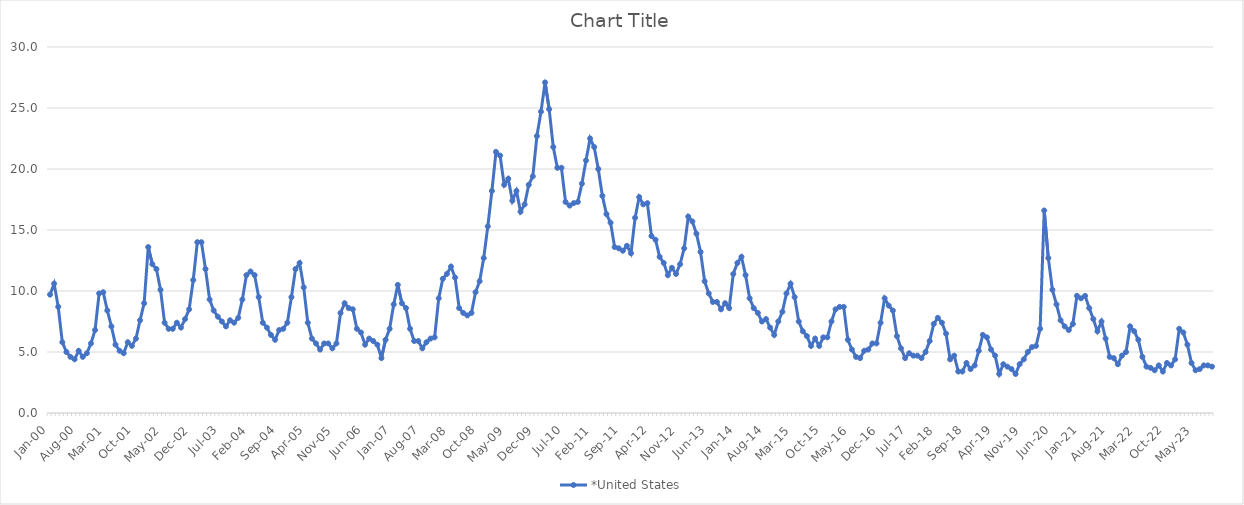
| Category | *United States | Alaska | Alabama | Arkansas | Arizona | California | Colorado | Connecticut | Delaware | Florida | Georgia | Hawaii | Iowa | Idaho | Illinois | Indiana | Kansas | Kentucky | Louisiana | Massachusetts | Maryland | Maine | Michigan | Minnesota | Missouri | Mississippi | Montana | North Carolina | North Dakota | Nebraska | New Hampshire | New Jersey | New Mexico | Nevada | New York | Ohio | Oklahoma | Oregon | Pennsylvania | Rhode Island | South Carolina | South Dakota | Tennessee | Texas | Utah | Virginia | Vermont | Washington | Wisconsin | West Virginia | Wyoming |
|---|---|---|---|---|---|---|---|---|---|---|---|---|---|---|---|---|---|---|---|---|---|---|---|---|---|---|---|---|---|---|---|---|---|---|---|---|---|---|---|---|---|---|---|---|---|---|---|---|---|---|---|
| Jan-00 | 9.7 |  |  |  |  |  |  |  |  |  |  |  |  |  |  |  |  |  |  |  |  |  |  |  |  |  |  |  |  |  |  |  |  |  |  |  |  |  |  |  |  |  |  |  |  |  |  |  |  |  |  |
| Feb-00 | 10.6 |  |  |  |  |  |  |  |  |  |  |  |  |  |  |  |  |  |  |  |  |  |  |  |  |  |  |  |  |  |  |  |  |  |  |  |  |  |  |  |  |  |  |  |  |  |  |  |  |  |  |
| Mar-00 | 8.7 |  |  |  |  |  |  |  |  |  |  |  |  |  |  |  |  |  |  |  |  |  |  |  |  |  |  |  |  |  |  |  |  |  |  |  |  |  |  |  |  |  |  |  |  |  |  |  |  |  |  |
| Apr-00 | 5.8 |  |  |  |  |  |  |  |  |  |  |  |  |  |  |  |  |  |  |  |  |  |  |  |  |  |  |  |  |  |  |  |  |  |  |  |  |  |  |  |  |  |  |  |  |  |  |  |  |  |  |
| May-00 | 5 |  |  |  |  |  |  |  |  |  |  |  |  |  |  |  |  |  |  |  |  |  |  |  |  |  |  |  |  |  |  |  |  |  |  |  |  |  |  |  |  |  |  |  |  |  |  |  |  |  |  |
| Jun-00 | 4.6 |  |  |  |  |  |  |  |  |  |  |  |  |  |  |  |  |  |  |  |  |  |  |  |  |  |  |  |  |  |  |  |  |  |  |  |  |  |  |  |  |  |  |  |  |  |  |  |  |  |  |
| Jul-00 | 4.4 |  |  |  |  |  |  |  |  |  |  |  |  |  |  |  |  |  |  |  |  |  |  |  |  |  |  |  |  |  |  |  |  |  |  |  |  |  |  |  |  |  |  |  |  |  |  |  |  |  |  |
| Aug-00 | 5.1 |  |  |  |  |  |  |  |  |  |  |  |  |  |  |  |  |  |  |  |  |  |  |  |  |  |  |  |  |  |  |  |  |  |  |  |  |  |  |  |  |  |  |  |  |  |  |  |  |  |  |
| Sep-00 | 4.6 |  |  |  |  |  |  |  |  |  |  |  |  |  |  |  |  |  |  |  |  |  |  |  |  |  |  |  |  |  |  |  |  |  |  |  |  |  |  |  |  |  |  |  |  |  |  |  |  |  |  |
| Oct-00 | 4.9 |  |  |  |  |  |  |  |  |  |  |  |  |  |  |  |  |  |  |  |  |  |  |  |  |  |  |  |  |  |  |  |  |  |  |  |  |  |  |  |  |  |  |  |  |  |  |  |  |  |  |
| Nov-00 | 5.7 |  |  |  |  |  |  |  |  |  |  |  |  |  |  |  |  |  |  |  |  |  |  |  |  |  |  |  |  |  |  |  |  |  |  |  |  |  |  |  |  |  |  |  |  |  |  |  |  |  |  |
| Dec-00 | 6.8 |  |  |  |  |  |  |  |  |  |  |  |  |  |  |  |  |  |  |  |  |  |  |  |  |  |  |  |  |  |  |  |  |  |  |  |  |  |  |  |  |  |  |  |  |  |  |  |  |  |  |
| Jan-01 | 9.8 |  |  |  |  |  |  |  |  |  |  |  |  |  |  |  |  |  |  |  |  |  |  |  |  |  |  |  |  |  |  |  |  |  |  |  |  |  |  |  |  |  |  |  |  |  |  |  |  |  |  |
| Feb-01 | 9.9 |  |  |  |  |  |  |  |  |  |  |  |  |  |  |  |  |  |  |  |  |  |  |  |  |  |  |  |  |  |  |  |  |  |  |  |  |  |  |  |  |  |  |  |  |  |  |  |  |  |  |
| Mar-01 | 8.4 |  |  |  |  |  |  |  |  |  |  |  |  |  |  |  |  |  |  |  |  |  |  |  |  |  |  |  |  |  |  |  |  |  |  |  |  |  |  |  |  |  |  |  |  |  |  |  |  |  |  |
| Apr-01 | 7.1 |  |  |  |  |  |  |  |  |  |  |  |  |  |  |  |  |  |  |  |  |  |  |  |  |  |  |  |  |  |  |  |  |  |  |  |  |  |  |  |  |  |  |  |  |  |  |  |  |  |  |
| May-01 | 5.6 |  |  |  |  |  |  |  |  |  |  |  |  |  |  |  |  |  |  |  |  |  |  |  |  |  |  |  |  |  |  |  |  |  |  |  |  |  |  |  |  |  |  |  |  |  |  |  |  |  |  |
| Jun-01 | 5.1 |  |  |  |  |  |  |  |  |  |  |  |  |  |  |  |  |  |  |  |  |  |  |  |  |  |  |  |  |  |  |  |  |  |  |  |  |  |  |  |  |  |  |  |  |  |  |  |  |  |  |
| Jul-01 | 4.9 |  |  |  |  |  |  |  |  |  |  |  |  |  |  |  |  |  |  |  |  |  |  |  |  |  |  |  |  |  |  |  |  |  |  |  |  |  |  |  |  |  |  |  |  |  |  |  |  |  |  |
| Aug-01 | 5.8 |  |  |  |  |  |  |  |  |  |  |  |  |  |  |  |  |  |  |  |  |  |  |  |  |  |  |  |  |  |  |  |  |  |  |  |  |  |  |  |  |  |  |  |  |  |  |  |  |  |  |
| Sep-01 | 5.5 |  |  |  |  |  |  |  |  |  |  |  |  |  |  |  |  |  |  |  |  |  |  |  |  |  |  |  |  |  |  |  |  |  |  |  |  |  |  |  |  |  |  |  |  |  |  |  |  |  |  |
| Oct-01 | 6.1 |  |  |  |  |  |  |  |  |  |  |  |  |  |  |  |  |  |  |  |  |  |  |  |  |  |  |  |  |  |  |  |  |  |  |  |  |  |  |  |  |  |  |  |  |  |  |  |  |  |  |
| Nov-01 | 7.6 |  |  |  |  |  |  |  |  |  |  |  |  |  |  |  |  |  |  |  |  |  |  |  |  |  |  |  |  |  |  |  |  |  |  |  |  |  |  |  |  |  |  |  |  |  |  |  |  |  |  |
| Dec-01 | 9 |  |  |  |  |  |  |  |  |  |  |  |  |  |  |  |  |  |  |  |  |  |  |  |  |  |  |  |  |  |  |  |  |  |  |  |  |  |  |  |  |  |  |  |  |  |  |  |  |  |  |
| Jan-02 | 13.6 |  |  |  |  |  |  |  |  |  |  |  |  |  |  |  |  |  |  |  |  |  |  |  |  |  |  |  |  |  |  |  |  |  |  |  |  |  |  |  |  |  |  |  |  |  |  |  |  |  |  |
| Feb-02 | 12.2 |  |  |  |  |  |  |  |  |  |  |  |  |  |  |  |  |  |  |  |  |  |  |  |  |  |  |  |  |  |  |  |  |  |  |  |  |  |  |  |  |  |  |  |  |  |  |  |  |  |  |
| Mar-02 | 11.8 |  |  |  |  |  |  |  |  |  |  |  |  |  |  |  |  |  |  |  |  |  |  |  |  |  |  |  |  |  |  |  |  |  |  |  |  |  |  |  |  |  |  |  |  |  |  |  |  |  |  |
| Apr-02 | 10.1 |  |  |  |  |  |  |  |  |  |  |  |  |  |  |  |  |  |  |  |  |  |  |  |  |  |  |  |  |  |  |  |  |  |  |  |  |  |  |  |  |  |  |  |  |  |  |  |  |  |  |
| May-02 | 7.4 |  |  |  |  |  |  |  |  |  |  |  |  |  |  |  |  |  |  |  |  |  |  |  |  |  |  |  |  |  |  |  |  |  |  |  |  |  |  |  |  |  |  |  |  |  |  |  |  |  |  |
| Jun-02 | 6.9 |  |  |  |  |  |  |  |  |  |  |  |  |  |  |  |  |  |  |  |  |  |  |  |  |  |  |  |  |  |  |  |  |  |  |  |  |  |  |  |  |  |  |  |  |  |  |  |  |  |  |
| Jul-02 | 6.9 |  |  |  |  |  |  |  |  |  |  |  |  |  |  |  |  |  |  |  |  |  |  |  |  |  |  |  |  |  |  |  |  |  |  |  |  |  |  |  |  |  |  |  |  |  |  |  |  |  |  |
| Aug-02 | 7.4 |  |  |  |  |  |  |  |  |  |  |  |  |  |  |  |  |  |  |  |  |  |  |  |  |  |  |  |  |  |  |  |  |  |  |  |  |  |  |  |  |  |  |  |  |  |  |  |  |  |  |
| Sep-02 | 7 |  |  |  |  |  |  |  |  |  |  |  |  |  |  |  |  |  |  |  |  |  |  |  |  |  |  |  |  |  |  |  |  |  |  |  |  |  |  |  |  |  |  |  |  |  |  |  |  |  |  |
| Oct-02 | 7.7 |  |  |  |  |  |  |  |  |  |  |  |  |  |  |  |  |  |  |  |  |  |  |  |  |  |  |  |  |  |  |  |  |  |  |  |  |  |  |  |  |  |  |  |  |  |  |  |  |  |  |
| Nov-02 | 8.5 |  |  |  |  |  |  |  |  |  |  |  |  |  |  |  |  |  |  |  |  |  |  |  |  |  |  |  |  |  |  |  |  |  |  |  |  |  |  |  |  |  |  |  |  |  |  |  |  |  |  |
| Dec-02 | 10.9 |  |  |  |  |  |  |  |  |  |  |  |  |  |  |  |  |  |  |  |  |  |  |  |  |  |  |  |  |  |  |  |  |  |  |  |  |  |  |  |  |  |  |  |  |  |  |  |  |  |  |
| Jan-03 | 14 |  |  |  |  |  |  |  |  |  |  |  |  |  |  |  |  |  |  |  |  |  |  |  |  |  |  |  |  |  |  |  |  |  |  |  |  |  |  |  |  |  |  |  |  |  |  |  |  |  |  |
| Feb-03 | 14 |  |  |  |  |  |  |  |  |  |  |  |  |  |  |  |  |  |  |  |  |  |  |  |  |  |  |  |  |  |  |  |  |  |  |  |  |  |  |  |  |  |  |  |  |  |  |  |  |  |  |
| Mar-03 | 11.8 |  |  |  |  |  |  |  |  |  |  |  |  |  |  |  |  |  |  |  |  |  |  |  |  |  |  |  |  |  |  |  |  |  |  |  |  |  |  |  |  |  |  |  |  |  |  |  |  |  |  |
| Apr-03 | 9.3 |  |  |  |  |  |  |  |  |  |  |  |  |  |  |  |  |  |  |  |  |  |  |  |  |  |  |  |  |  |  |  |  |  |  |  |  |  |  |  |  |  |  |  |  |  |  |  |  |  |  |
| May-03 | 8.4 |  |  |  |  |  |  |  |  |  |  |  |  |  |  |  |  |  |  |  |  |  |  |  |  |  |  |  |  |  |  |  |  |  |  |  |  |  |  |  |  |  |  |  |  |  |  |  |  |  |  |
| Jun-03 | 7.9 |  |  |  |  |  |  |  |  |  |  |  |  |  |  |  |  |  |  |  |  |  |  |  |  |  |  |  |  |  |  |  |  |  |  |  |  |  |  |  |  |  |  |  |  |  |  |  |  |  |  |
| Jul-03 | 7.5 |  |  |  |  |  |  |  |  |  |  |  |  |  |  |  |  |  |  |  |  |  |  |  |  |  |  |  |  |  |  |  |  |  |  |  |  |  |  |  |  |  |  |  |  |  |  |  |  |  |  |
| Aug-03 | 7.1 |  |  |  |  |  |  |  |  |  |  |  |  |  |  |  |  |  |  |  |  |  |  |  |  |  |  |  |  |  |  |  |  |  |  |  |  |  |  |  |  |  |  |  |  |  |  |  |  |  |  |
| Sep-03 | 7.6 |  |  |  |  |  |  |  |  |  |  |  |  |  |  |  |  |  |  |  |  |  |  |  |  |  |  |  |  |  |  |  |  |  |  |  |  |  |  |  |  |  |  |  |  |  |  |  |  |  |  |
| Oct-03 | 7.4 |  |  |  |  |  |  |  |  |  |  |  |  |  |  |  |  |  |  |  |  |  |  |  |  |  |  |  |  |  |  |  |  |  |  |  |  |  |  |  |  |  |  |  |  |  |  |  |  |  |  |
| Nov-03 | 7.8 |  |  |  |  |  |  |  |  |  |  |  |  |  |  |  |  |  |  |  |  |  |  |  |  |  |  |  |  |  |  |  |  |  |  |  |  |  |  |  |  |  |  |  |  |  |  |  |  |  |  |
| Dec-03 | 9.3 |  |  |  |  |  |  |  |  |  |  |  |  |  |  |  |  |  |  |  |  |  |  |  |  |  |  |  |  |  |  |  |  |  |  |  |  |  |  |  |  |  |  |  |  |  |  |  |  |  |  |
| Jan-04 | 11.3 |  |  |  |  |  |  |  |  |  |  |  |  |  |  |  |  |  |  |  |  |  |  |  |  |  |  |  |  |  |  |  |  |  |  |  |  |  |  |  |  |  |  |  |  |  |  |  |  |  |  |
| Feb-04 | 11.6 |  |  |  |  |  |  |  |  |  |  |  |  |  |  |  |  |  |  |  |  |  |  |  |  |  |  |  |  |  |  |  |  |  |  |  |  |  |  |  |  |  |  |  |  |  |  |  |  |  |  |
| Mar-04 | 11.3 |  |  |  |  |  |  |  |  |  |  |  |  |  |  |  |  |  |  |  |  |  |  |  |  |  |  |  |  |  |  |  |  |  |  |  |  |  |  |  |  |  |  |  |  |  |  |  |  |  |  |
| Apr-04 | 9.5 |  |  |  |  |  |  |  |  |  |  |  |  |  |  |  |  |  |  |  |  |  |  |  |  |  |  |  |  |  |  |  |  |  |  |  |  |  |  |  |  |  |  |  |  |  |  |  |  |  |  |
| May-04 | 7.4 |  |  |  |  |  |  |  |  |  |  |  |  |  |  |  |  |  |  |  |  |  |  |  |  |  |  |  |  |  |  |  |  |  |  |  |  |  |  |  |  |  |  |  |  |  |  |  |  |  |  |
| Jun-04 | 7 |  |  |  |  |  |  |  |  |  |  |  |  |  |  |  |  |  |  |  |  |  |  |  |  |  |  |  |  |  |  |  |  |  |  |  |  |  |  |  |  |  |  |  |  |  |  |  |  |  |  |
| Jul-04 | 6.4 |  |  |  |  |  |  |  |  |  |  |  |  |  |  |  |  |  |  |  |  |  |  |  |  |  |  |  |  |  |  |  |  |  |  |  |  |  |  |  |  |  |  |  |  |  |  |  |  |  |  |
| Aug-04 | 6 |  |  |  |  |  |  |  |  |  |  |  |  |  |  |  |  |  |  |  |  |  |  |  |  |  |  |  |  |  |  |  |  |  |  |  |  |  |  |  |  |  |  |  |  |  |  |  |  |  |  |
| Sep-04 | 6.8 |  |  |  |  |  |  |  |  |  |  |  |  |  |  |  |  |  |  |  |  |  |  |  |  |  |  |  |  |  |  |  |  |  |  |  |  |  |  |  |  |  |  |  |  |  |  |  |  |  |  |
| Oct-04 | 6.9 |  |  |  |  |  |  |  |  |  |  |  |  |  |  |  |  |  |  |  |  |  |  |  |  |  |  |  |  |  |  |  |  |  |  |  |  |  |  |  |  |  |  |  |  |  |  |  |  |  |  |
| Nov-04 | 7.4 |  |  |  |  |  |  |  |  |  |  |  |  |  |  |  |  |  |  |  |  |  |  |  |  |  |  |  |  |  |  |  |  |  |  |  |  |  |  |  |  |  |  |  |  |  |  |  |  |  |  |
| Dec-04 | 9.5 |  |  |  |  |  |  |  |  |  |  |  |  |  |  |  |  |  |  |  |  |  |  |  |  |  |  |  |  |  |  |  |  |  |  |  |  |  |  |  |  |  |  |  |  |  |  |  |  |  |  |
| Jan-05 | 11.8 |  |  |  |  |  |  |  |  |  |  |  |  |  |  |  |  |  |  |  |  |  |  |  |  |  |  |  |  |  |  |  |  |  |  |  |  |  |  |  |  |  |  |  |  |  |  |  |  |  |  |
| Feb-05 | 12.3 |  |  |  |  |  |  |  |  |  |  |  |  |  |  |  |  |  |  |  |  |  |  |  |  |  |  |  |  |  |  |  |  |  |  |  |  |  |  |  |  |  |  |  |  |  |  |  |  |  |  |
| Mar-05 | 10.3 |  |  |  |  |  |  |  |  |  |  |  |  |  |  |  |  |  |  |  |  |  |  |  |  |  |  |  |  |  |  |  |  |  |  |  |  |  |  |  |  |  |  |  |  |  |  |  |  |  |  |
| Apr-05 | 7.4 |  |  |  |  |  |  |  |  |  |  |  |  |  |  |  |  |  |  |  |  |  |  |  |  |  |  |  |  |  |  |  |  |  |  |  |  |  |  |  |  |  |  |  |  |  |  |  |  |  |  |
| May-05 | 6.1 |  |  |  |  |  |  |  |  |  |  |  |  |  |  |  |  |  |  |  |  |  |  |  |  |  |  |  |  |  |  |  |  |  |  |  |  |  |  |  |  |  |  |  |  |  |  |  |  |  |  |
| Jun-05 | 5.7 |  |  |  |  |  |  |  |  |  |  |  |  |  |  |  |  |  |  |  |  |  |  |  |  |  |  |  |  |  |  |  |  |  |  |  |  |  |  |  |  |  |  |  |  |  |  |  |  |  |  |
| Jul-05 | 5.2 |  |  |  |  |  |  |  |  |  |  |  |  |  |  |  |  |  |  |  |  |  |  |  |  |  |  |  |  |  |  |  |  |  |  |  |  |  |  |  |  |  |  |  |  |  |  |  |  |  |  |
| Aug-05 | 5.7 |  |  |  |  |  |  |  |  |  |  |  |  |  |  |  |  |  |  |  |  |  |  |  |  |  |  |  |  |  |  |  |  |  |  |  |  |  |  |  |  |  |  |  |  |  |  |  |  |  |  |
| Sep-05 | 5.7 |  |  |  |  |  |  |  |  |  |  |  |  |  |  |  |  |  |  |  |  |  |  |  |  |  |  |  |  |  |  |  |  |  |  |  |  |  |  |  |  |  |  |  |  |  |  |  |  |  |  |
| Oct-05 | 5.3 |  |  |  |  |  |  |  |  |  |  |  |  |  |  |  |  |  |  |  |  |  |  |  |  |  |  |  |  |  |  |  |  |  |  |  |  |  |  |  |  |  |  |  |  |  |  |  |  |  |  |
| Nov-05 | 5.7 |  |  |  |  |  |  |  |  |  |  |  |  |  |  |  |  |  |  |  |  |  |  |  |  |  |  |  |  |  |  |  |  |  |  |  |  |  |  |  |  |  |  |  |  |  |  |  |  |  |  |
| Dec-05 | 8.2 |  |  |  |  |  |  |  |  |  |  |  |  |  |  |  |  |  |  |  |  |  |  |  |  |  |  |  |  |  |  |  |  |  |  |  |  |  |  |  |  |  |  |  |  |  |  |  |  |  |  |
| Jan-06 | 9 |  |  |  |  |  |  |  |  |  |  |  |  |  |  |  |  |  |  |  |  |  |  |  |  |  |  |  |  |  |  |  |  |  |  |  |  |  |  |  |  |  |  |  |  |  |  |  |  |  |  |
| Feb-06 | 8.6 |  |  |  |  |  |  |  |  |  |  |  |  |  |  |  |  |  |  |  |  |  |  |  |  |  |  |  |  |  |  |  |  |  |  |  |  |  |  |  |  |  |  |  |  |  |  |  |  |  |  |
| Mar-06 | 8.5 |  |  |  |  |  |  |  |  |  |  |  |  |  |  |  |  |  |  |  |  |  |  |  |  |  |  |  |  |  |  |  |  |  |  |  |  |  |  |  |  |  |  |  |  |  |  |  |  |  |  |
| Apr-06 | 6.9 |  |  |  |  |  |  |  |  |  |  |  |  |  |  |  |  |  |  |  |  |  |  |  |  |  |  |  |  |  |  |  |  |  |  |  |  |  |  |  |  |  |  |  |  |  |  |  |  |  |  |
| May-06 | 6.6 |  |  |  |  |  |  |  |  |  |  |  |  |  |  |  |  |  |  |  |  |  |  |  |  |  |  |  |  |  |  |  |  |  |  |  |  |  |  |  |  |  |  |  |  |  |  |  |  |  |  |
| Jun-06 | 5.6 |  |  |  |  |  |  |  |  |  |  |  |  |  |  |  |  |  |  |  |  |  |  |  |  |  |  |  |  |  |  |  |  |  |  |  |  |  |  |  |  |  |  |  |  |  |  |  |  |  |  |
| Jul-06 | 6.1 |  |  |  |  |  |  |  |  |  |  |  |  |  |  |  |  |  |  |  |  |  |  |  |  |  |  |  |  |  |  |  |  |  |  |  |  |  |  |  |  |  |  |  |  |  |  |  |  |  |  |
| Aug-06 | 5.9 |  |  |  |  |  |  |  |  |  |  |  |  |  |  |  |  |  |  |  |  |  |  |  |  |  |  |  |  |  |  |  |  |  |  |  |  |  |  |  |  |  |  |  |  |  |  |  |  |  |  |
| Sep-06 | 5.6 |  |  |  |  |  |  |  |  |  |  |  |  |  |  |  |  |  |  |  |  |  |  |  |  |  |  |  |  |  |  |  |  |  |  |  |  |  |  |  |  |  |  |  |  |  |  |  |  |  |  |
| Oct-06 | 4.5 |  |  |  |  |  |  |  |  |  |  |  |  |  |  |  |  |  |  |  |  |  |  |  |  |  |  |  |  |  |  |  |  |  |  |  |  |  |  |  |  |  |  |  |  |  |  |  |  |  |  |
| Nov-06 | 6 |  |  |  |  |  |  |  |  |  |  |  |  |  |  |  |  |  |  |  |  |  |  |  |  |  |  |  |  |  |  |  |  |  |  |  |  |  |  |  |  |  |  |  |  |  |  |  |  |  |  |
| Dec-06 | 6.9 |  |  |  |  |  |  |  |  |  |  |  |  |  |  |  |  |  |  |  |  |  |  |  |  |  |  |  |  |  |  |  |  |  |  |  |  |  |  |  |  |  |  |  |  |  |  |  |  |  |  |
| Jan-07 | 8.9 |  |  |  |  |  |  |  |  |  |  |  |  |  |  |  |  |  |  |  |  |  |  |  |  |  |  |  |  |  |  |  |  |  |  |  |  |  |  |  |  |  |  |  |  |  |  |  |  |  |  |
| Feb-07 | 10.5 |  |  |  |  |  |  |  |  |  |  |  |  |  |  |  |  |  |  |  |  |  |  |  |  |  |  |  |  |  |  |  |  |  |  |  |  |  |  |  |  |  |  |  |  |  |  |  |  |  |  |
| Mar-07 | 9 |  |  |  |  |  |  |  |  |  |  |  |  |  |  |  |  |  |  |  |  |  |  |  |  |  |  |  |  |  |  |  |  |  |  |  |  |  |  |  |  |  |  |  |  |  |  |  |  |  |  |
| Apr-07 | 8.6 |  |  |  |  |  |  |  |  |  |  |  |  |  |  |  |  |  |  |  |  |  |  |  |  |  |  |  |  |  |  |  |  |  |  |  |  |  |  |  |  |  |  |  |  |  |  |  |  |  |  |
| May-07 | 6.9 |  |  |  |  |  |  |  |  |  |  |  |  |  |  |  |  |  |  |  |  |  |  |  |  |  |  |  |  |  |  |  |  |  |  |  |  |  |  |  |  |  |  |  |  |  |  |  |  |  |  |
| Jun-07 | 5.9 |  |  |  |  |  |  |  |  |  |  |  |  |  |  |  |  |  |  |  |  |  |  |  |  |  |  |  |  |  |  |  |  |  |  |  |  |  |  |  |  |  |  |  |  |  |  |  |  |  |  |
| Jul-07 | 5.9 |  |  |  |  |  |  |  |  |  |  |  |  |  |  |  |  |  |  |  |  |  |  |  |  |  |  |  |  |  |  |  |  |  |  |  |  |  |  |  |  |  |  |  |  |  |  |  |  |  |  |
| Aug-07 | 5.3 |  |  |  |  |  |  |  |  |  |  |  |  |  |  |  |  |  |  |  |  |  |  |  |  |  |  |  |  |  |  |  |  |  |  |  |  |  |  |  |  |  |  |  |  |  |  |  |  |  |  |
| Sep-07 | 5.8 |  |  |  |  |  |  |  |  |  |  |  |  |  |  |  |  |  |  |  |  |  |  |  |  |  |  |  |  |  |  |  |  |  |  |  |  |  |  |  |  |  |  |  |  |  |  |  |  |  |  |
| Oct-07 | 6.1 |  |  |  |  |  |  |  |  |  |  |  |  |  |  |  |  |  |  |  |  |  |  |  |  |  |  |  |  |  |  |  |  |  |  |  |  |  |  |  |  |  |  |  |  |  |  |  |  |  |  |
| Nov-07 | 6.2 |  |  |  |  |  |  |  |  |  |  |  |  |  |  |  |  |  |  |  |  |  |  |  |  |  |  |  |  |  |  |  |  |  |  |  |  |  |  |  |  |  |  |  |  |  |  |  |  |  |  |
| Dec-07 | 9.4 |  |  |  |  |  |  |  |  |  |  |  |  |  |  |  |  |  |  |  |  |  |  |  |  |  |  |  |  |  |  |  |  |  |  |  |  |  |  |  |  |  |  |  |  |  |  |  |  |  |  |
| Jan-08 | 11 |  |  |  |  |  |  |  |  |  |  |  |  |  |  |  |  |  |  |  |  |  |  |  |  |  |  |  |  |  |  |  |  |  |  |  |  |  |  |  |  |  |  |  |  |  |  |  |  |  |  |
| Feb-08 | 11.4 |  |  |  |  |  |  |  |  |  |  |  |  |  |  |  |  |  |  |  |  |  |  |  |  |  |  |  |  |  |  |  |  |  |  |  |  |  |  |  |  |  |  |  |  |  |  |  |  |  |  |
| Mar-08 | 12 |  |  |  |  |  |  |  |  |  |  |  |  |  |  |  |  |  |  |  |  |  |  |  |  |  |  |  |  |  |  |  |  |  |  |  |  |  |  |  |  |  |  |  |  |  |  |  |  |  |  |
| Apr-08 | 11.1 |  |  |  |  |  |  |  |  |  |  |  |  |  |  |  |  |  |  |  |  |  |  |  |  |  |  |  |  |  |  |  |  |  |  |  |  |  |  |  |  |  |  |  |  |  |  |  |  |  |  |
| May-08 | 8.6 |  |  |  |  |  |  |  |  |  |  |  |  |  |  |  |  |  |  |  |  |  |  |  |  |  |  |  |  |  |  |  |  |  |  |  |  |  |  |  |  |  |  |  |  |  |  |  |  |  |  |
| Jun-08 | 8.2 |  |  |  |  |  |  |  |  |  |  |  |  |  |  |  |  |  |  |  |  |  |  |  |  |  |  |  |  |  |  |  |  |  |  |  |  |  |  |  |  |  |  |  |  |  |  |  |  |  |  |
| Jul-08 | 8 |  |  |  |  |  |  |  |  |  |  |  |  |  |  |  |  |  |  |  |  |  |  |  |  |  |  |  |  |  |  |  |  |  |  |  |  |  |  |  |  |  |  |  |  |  |  |  |  |  |  |
| Aug-08 | 8.2 |  |  |  |  |  |  |  |  |  |  |  |  |  |  |  |  |  |  |  |  |  |  |  |  |  |  |  |  |  |  |  |  |  |  |  |  |  |  |  |  |  |  |  |  |  |  |  |  |  |  |
| Sep-08 | 9.9 |  |  |  |  |  |  |  |  |  |  |  |  |  |  |  |  |  |  |  |  |  |  |  |  |  |  |  |  |  |  |  |  |  |  |  |  |  |  |  |  |  |  |  |  |  |  |  |  |  |  |
| Oct-08 | 10.8 |  |  |  |  |  |  |  |  |  |  |  |  |  |  |  |  |  |  |  |  |  |  |  |  |  |  |  |  |  |  |  |  |  |  |  |  |  |  |  |  |  |  |  |  |  |  |  |  |  |  |
| Nov-08 | 12.7 |  |  |  |  |  |  |  |  |  |  |  |  |  |  |  |  |  |  |  |  |  |  |  |  |  |  |  |  |  |  |  |  |  |  |  |  |  |  |  |  |  |  |  |  |  |  |  |  |  |  |
| Dec-08 | 15.3 |  |  |  |  |  |  |  |  |  |  |  |  |  |  |  |  |  |  |  |  |  |  |  |  |  |  |  |  |  |  |  |  |  |  |  |  |  |  |  |  |  |  |  |  |  |  |  |  |  |  |
| Jan-09 | 18.2 |  |  |  |  |  |  |  |  |  |  |  |  |  |  |  |  |  |  |  |  |  |  |  |  |  |  |  |  |  |  |  |  |  |  |  |  |  |  |  |  |  |  |  |  |  |  |  |  |  |  |
| Feb-09 | 21.4 |  |  |  |  |  |  |  |  |  |  |  |  |  |  |  |  |  |  |  |  |  |  |  |  |  |  |  |  |  |  |  |  |  |  |  |  |  |  |  |  |  |  |  |  |  |  |  |  |  |  |
| Mar-09 | 21.1 |  |  |  |  |  |  |  |  |  |  |  |  |  |  |  |  |  |  |  |  |  |  |  |  |  |  |  |  |  |  |  |  |  |  |  |  |  |  |  |  |  |  |  |  |  |  |  |  |  |  |
| Apr-09 | 18.7 |  |  |  |  |  |  |  |  |  |  |  |  |  |  |  |  |  |  |  |  |  |  |  |  |  |  |  |  |  |  |  |  |  |  |  |  |  |  |  |  |  |  |  |  |  |  |  |  |  |  |
| May-09 | 19.2 |  |  |  |  |  |  |  |  |  |  |  |  |  |  |  |  |  |  |  |  |  |  |  |  |  |  |  |  |  |  |  |  |  |  |  |  |  |  |  |  |  |  |  |  |  |  |  |  |  |  |
| Jun-09 | 17.4 |  |  |  |  |  |  |  |  |  |  |  |  |  |  |  |  |  |  |  |  |  |  |  |  |  |  |  |  |  |  |  |  |  |  |  |  |  |  |  |  |  |  |  |  |  |  |  |  |  |  |
| Jul-09 | 18.2 |  |  |  |  |  |  |  |  |  |  |  |  |  |  |  |  |  |  |  |  |  |  |  |  |  |  |  |  |  |  |  |  |  |  |  |  |  |  |  |  |  |  |  |  |  |  |  |  |  |  |
| Aug-09 | 16.5 |  |  |  |  |  |  |  |  |  |  |  |  |  |  |  |  |  |  |  |  |  |  |  |  |  |  |  |  |  |  |  |  |  |  |  |  |  |  |  |  |  |  |  |  |  |  |  |  |  |  |
| Sep-09 | 17.1 |  |  |  |  |  |  |  |  |  |  |  |  |  |  |  |  |  |  |  |  |  |  |  |  |  |  |  |  |  |  |  |  |  |  |  |  |  |  |  |  |  |  |  |  |  |  |  |  |  |  |
| Oct-09 | 18.7 |  |  |  |  |  |  |  |  |  |  |  |  |  |  |  |  |  |  |  |  |  |  |  |  |  |  |  |  |  |  |  |  |  |  |  |  |  |  |  |  |  |  |  |  |  |  |  |  |  |  |
| Nov-09 | 19.4 |  |  |  |  |  |  |  |  |  |  |  |  |  |  |  |  |  |  |  |  |  |  |  |  |  |  |  |  |  |  |  |  |  |  |  |  |  |  |  |  |  |  |  |  |  |  |  |  |  |  |
| Dec-09 | 22.7 |  |  |  |  |  |  |  |  |  |  |  |  |  |  |  |  |  |  |  |  |  |  |  |  |  |  |  |  |  |  |  |  |  |  |  |  |  |  |  |  |  |  |  |  |  |  |  |  |  |  |
| Jan-10 | 24.7 |  |  |  |  |  |  |  |  |  |  |  |  |  |  |  |  |  |  |  |  |  |  |  |  |  |  |  |  |  |  |  |  |  |  |  |  |  |  |  |  |  |  |  |  |  |  |  |  |  |  |
| Feb-10 | 27.1 |  |  |  |  |  |  |  |  |  |  |  |  |  |  |  |  |  |  |  |  |  |  |  |  |  |  |  |  |  |  |  |  |  |  |  |  |  |  |  |  |  |  |  |  |  |  |  |  |  |  |
| Mar-10 | 24.9 |  |  |  |  |  |  |  |  |  |  |  |  |  |  |  |  |  |  |  |  |  |  |  |  |  |  |  |  |  |  |  |  |  |  |  |  |  |  |  |  |  |  |  |  |  |  |  |  |  |  |
| Apr-10 | 21.8 |  |  |  |  |  |  |  |  |  |  |  |  |  |  |  |  |  |  |  |  |  |  |  |  |  |  |  |  |  |  |  |  |  |  |  |  |  |  |  |  |  |  |  |  |  |  |  |  |  |  |
| May-10 | 20.1 |  |  |  |  |  |  |  |  |  |  |  |  |  |  |  |  |  |  |  |  |  |  |  |  |  |  |  |  |  |  |  |  |  |  |  |  |  |  |  |  |  |  |  |  |  |  |  |  |  |  |
| Jun-10 | 20.1 |  |  |  |  |  |  |  |  |  |  |  |  |  |  |  |  |  |  |  |  |  |  |  |  |  |  |  |  |  |  |  |  |  |  |  |  |  |  |  |  |  |  |  |  |  |  |  |  |  |  |
| Jul-10 | 17.3 |  |  |  |  |  |  |  |  |  |  |  |  |  |  |  |  |  |  |  |  |  |  |  |  |  |  |  |  |  |  |  |  |  |  |  |  |  |  |  |  |  |  |  |  |  |  |  |  |  |  |
| Aug-10 | 17 |  |  |  |  |  |  |  |  |  |  |  |  |  |  |  |  |  |  |  |  |  |  |  |  |  |  |  |  |  |  |  |  |  |  |  |  |  |  |  |  |  |  |  |  |  |  |  |  |  |  |
| Sep-10 | 17.2 |  |  |  |  |  |  |  |  |  |  |  |  |  |  |  |  |  |  |  |  |  |  |  |  |  |  |  |  |  |  |  |  |  |  |  |  |  |  |  |  |  |  |  |  |  |  |  |  |  |  |
| Oct-10 | 17.3 |  |  |  |  |  |  |  |  |  |  |  |  |  |  |  |  |  |  |  |  |  |  |  |  |  |  |  |  |  |  |  |  |  |  |  |  |  |  |  |  |  |  |  |  |  |  |  |  |  |  |
| Nov-10 | 18.8 |  |  |  |  |  |  |  |  |  |  |  |  |  |  |  |  |  |  |  |  |  |  |  |  |  |  |  |  |  |  |  |  |  |  |  |  |  |  |  |  |  |  |  |  |  |  |  |  |  |  |
| Dec-10 | 20.7 |  |  |  |  |  |  |  |  |  |  |  |  |  |  |  |  |  |  |  |  |  |  |  |  |  |  |  |  |  |  |  |  |  |  |  |  |  |  |  |  |  |  |  |  |  |  |  |  |  |  |
| Jan-11 | 22.5 |  |  |  |  |  |  |  |  |  |  |  |  |  |  |  |  |  |  |  |  |  |  |  |  |  |  |  |  |  |  |  |  |  |  |  |  |  |  |  |  |  |  |  |  |  |  |  |  |  |  |
| Feb-11 | 21.8 |  |  |  |  |  |  |  |  |  |  |  |  |  |  |  |  |  |  |  |  |  |  |  |  |  |  |  |  |  |  |  |  |  |  |  |  |  |  |  |  |  |  |  |  |  |  |  |  |  |  |
| Mar-11 | 20 |  |  |  |  |  |  |  |  |  |  |  |  |  |  |  |  |  |  |  |  |  |  |  |  |  |  |  |  |  |  |  |  |  |  |  |  |  |  |  |  |  |  |  |  |  |  |  |  |  |  |
| Apr-11 | 17.8 |  |  |  |  |  |  |  |  |  |  |  |  |  |  |  |  |  |  |  |  |  |  |  |  |  |  |  |  |  |  |  |  |  |  |  |  |  |  |  |  |  |  |  |  |  |  |  |  |  |  |
| May-11 | 16.3 |  |  |  |  |  |  |  |  |  |  |  |  |  |  |  |  |  |  |  |  |  |  |  |  |  |  |  |  |  |  |  |  |  |  |  |  |  |  |  |  |  |  |  |  |  |  |  |  |  |  |
| Jun-11 | 15.6 |  |  |  |  |  |  |  |  |  |  |  |  |  |  |  |  |  |  |  |  |  |  |  |  |  |  |  |  |  |  |  |  |  |  |  |  |  |  |  |  |  |  |  |  |  |  |  |  |  |  |
| Jul-11 | 13.6 |  |  |  |  |  |  |  |  |  |  |  |  |  |  |  |  |  |  |  |  |  |  |  |  |  |  |  |  |  |  |  |  |  |  |  |  |  |  |  |  |  |  |  |  |  |  |  |  |  |  |
| Aug-11 | 13.5 |  |  |  |  |  |  |  |  |  |  |  |  |  |  |  |  |  |  |  |  |  |  |  |  |  |  |  |  |  |  |  |  |  |  |  |  |  |  |  |  |  |  |  |  |  |  |  |  |  |  |
| Sep-11 | 13.3 |  |  |  |  |  |  |  |  |  |  |  |  |  |  |  |  |  |  |  |  |  |  |  |  |  |  |  |  |  |  |  |  |  |  |  |  |  |  |  |  |  |  |  |  |  |  |  |  |  |  |
| Oct-11 | 13.7 |  |  |  |  |  |  |  |  |  |  |  |  |  |  |  |  |  |  |  |  |  |  |  |  |  |  |  |  |  |  |  |  |  |  |  |  |  |  |  |  |  |  |  |  |  |  |  |  |  |  |
| Nov-11 | 13.1 |  |  |  |  |  |  |  |  |  |  |  |  |  |  |  |  |  |  |  |  |  |  |  |  |  |  |  |  |  |  |  |  |  |  |  |  |  |  |  |  |  |  |  |  |  |  |  |  |  |  |
| Dec-11 | 16 |  |  |  |  |  |  |  |  |  |  |  |  |  |  |  |  |  |  |  |  |  |  |  |  |  |  |  |  |  |  |  |  |  |  |  |  |  |  |  |  |  |  |  |  |  |  |  |  |  |  |
| Jan-12 | 17.7 |  |  |  |  |  |  |  |  |  |  |  |  |  |  |  |  |  |  |  |  |  |  |  |  |  |  |  |  |  |  |  |  |  |  |  |  |  |  |  |  |  |  |  |  |  |  |  |  |  |  |
| Feb-12 | 17.1 |  |  |  |  |  |  |  |  |  |  |  |  |  |  |  |  |  |  |  |  |  |  |  |  |  |  |  |  |  |  |  |  |  |  |  |  |  |  |  |  |  |  |  |  |  |  |  |  |  |  |
| Mar-12 | 17.2 |  |  |  |  |  |  |  |  |  |  |  |  |  |  |  |  |  |  |  |  |  |  |  |  |  |  |  |  |  |  |  |  |  |  |  |  |  |  |  |  |  |  |  |  |  |  |  |  |  |  |
| Apr-12 | 14.5 |  |  |  |  |  |  |  |  |  |  |  |  |  |  |  |  |  |  |  |  |  |  |  |  |  |  |  |  |  |  |  |  |  |  |  |  |  |  |  |  |  |  |  |  |  |  |  |  |  |  |
| May-12 | 14.2 |  |  |  |  |  |  |  |  |  |  |  |  |  |  |  |  |  |  |  |  |  |  |  |  |  |  |  |  |  |  |  |  |  |  |  |  |  |  |  |  |  |  |  |  |  |  |  |  |  |  |
| Jun-12 | 12.8 |  |  |  |  |  |  |  |  |  |  |  |  |  |  |  |  |  |  |  |  |  |  |  |  |  |  |  |  |  |  |  |  |  |  |  |  |  |  |  |  |  |  |  |  |  |  |  |  |  |  |
| Jul-12 | 12.3 |  |  |  |  |  |  |  |  |  |  |  |  |  |  |  |  |  |  |  |  |  |  |  |  |  |  |  |  |  |  |  |  |  |  |  |  |  |  |  |  |  |  |  |  |  |  |  |  |  |  |
| Aug-12 | 11.3 |  |  |  |  |  |  |  |  |  |  |  |  |  |  |  |  |  |  |  |  |  |  |  |  |  |  |  |  |  |  |  |  |  |  |  |  |  |  |  |  |  |  |  |  |  |  |  |  |  |  |
| Sep-12 | 11.9 |  |  |  |  |  |  |  |  |  |  |  |  |  |  |  |  |  |  |  |  |  |  |  |  |  |  |  |  |  |  |  |  |  |  |  |  |  |  |  |  |  |  |  |  |  |  |  |  |  |  |
| Oct-12 | 11.4 |  |  |  |  |  |  |  |  |  |  |  |  |  |  |  |  |  |  |  |  |  |  |  |  |  |  |  |  |  |  |  |  |  |  |  |  |  |  |  |  |  |  |  |  |  |  |  |  |  |  |
| Nov-12 | 12.2 |  |  |  |  |  |  |  |  |  |  |  |  |  |  |  |  |  |  |  |  |  |  |  |  |  |  |  |  |  |  |  |  |  |  |  |  |  |  |  |  |  |  |  |  |  |  |  |  |  |  |
| Dec-12 | 13.5 |  |  |  |  |  |  |  |  |  |  |  |  |  |  |  |  |  |  |  |  |  |  |  |  |  |  |  |  |  |  |  |  |  |  |  |  |  |  |  |  |  |  |  |  |  |  |  |  |  |  |
| Jan-13 | 16.1 |  |  |  |  |  |  |  |  |  |  |  |  |  |  |  |  |  |  |  |  |  |  |  |  |  |  |  |  |  |  |  |  |  |  |  |  |  |  |  |  |  |  |  |  |  |  |  |  |  |  |
| Feb-13 | 15.7 |  |  |  |  |  |  |  |  |  |  |  |  |  |  |  |  |  |  |  |  |  |  |  |  |  |  |  |  |  |  |  |  |  |  |  |  |  |  |  |  |  |  |  |  |  |  |  |  |  |  |
| Mar-13 | 14.7 |  |  |  |  |  |  |  |  |  |  |  |  |  |  |  |  |  |  |  |  |  |  |  |  |  |  |  |  |  |  |  |  |  |  |  |  |  |  |  |  |  |  |  |  |  |  |  |  |  |  |
| Apr-13 | 13.2 |  |  |  |  |  |  |  |  |  |  |  |  |  |  |  |  |  |  |  |  |  |  |  |  |  |  |  |  |  |  |  |  |  |  |  |  |  |  |  |  |  |  |  |  |  |  |  |  |  |  |
| May-13 | 10.8 |  |  |  |  |  |  |  |  |  |  |  |  |  |  |  |  |  |  |  |  |  |  |  |  |  |  |  |  |  |  |  |  |  |  |  |  |  |  |  |  |  |  |  |  |  |  |  |  |  |  |
| Jun-13 | 9.8 |  |  |  |  |  |  |  |  |  |  |  |  |  |  |  |  |  |  |  |  |  |  |  |  |  |  |  |  |  |  |  |  |  |  |  |  |  |  |  |  |  |  |  |  |  |  |  |  |  |  |
| Jul-13 | 9.1 |  |  |  |  |  |  |  |  |  |  |  |  |  |  |  |  |  |  |  |  |  |  |  |  |  |  |  |  |  |  |  |  |  |  |  |  |  |  |  |  |  |  |  |  |  |  |  |  |  |  |
| Aug-13 | 9.1 |  |  |  |  |  |  |  |  |  |  |  |  |  |  |  |  |  |  |  |  |  |  |  |  |  |  |  |  |  |  |  |  |  |  |  |  |  |  |  |  |  |  |  |  |  |  |  |  |  |  |
| Sep-13 | 8.5 |  |  |  |  |  |  |  |  |  |  |  |  |  |  |  |  |  |  |  |  |  |  |  |  |  |  |  |  |  |  |  |  |  |  |  |  |  |  |  |  |  |  |  |  |  |  |  |  |  |  |
| Oct-13 | 9 |  |  |  |  |  |  |  |  |  |  |  |  |  |  |  |  |  |  |  |  |  |  |  |  |  |  |  |  |  |  |  |  |  |  |  |  |  |  |  |  |  |  |  |  |  |  |  |  |  |  |
| Nov-13 | 8.6 |  |  |  |  |  |  |  |  |  |  |  |  |  |  |  |  |  |  |  |  |  |  |  |  |  |  |  |  |  |  |  |  |  |  |  |  |  |  |  |  |  |  |  |  |  |  |  |  |  |  |
| Dec-13 | 11.4 |  |  |  |  |  |  |  |  |  |  |  |  |  |  |  |  |  |  |  |  |  |  |  |  |  |  |  |  |  |  |  |  |  |  |  |  |  |  |  |  |  |  |  |  |  |  |  |  |  |  |
| Jan-14 | 12.3 |  |  |  |  |  |  |  |  |  |  |  |  |  |  |  |  |  |  |  |  |  |  |  |  |  |  |  |  |  |  |  |  |  |  |  |  |  |  |  |  |  |  |  |  |  |  |  |  |  |  |
| Feb-14 | 12.8 |  |  |  |  |  |  |  |  |  |  |  |  |  |  |  |  |  |  |  |  |  |  |  |  |  |  |  |  |  |  |  |  |  |  |  |  |  |  |  |  |  |  |  |  |  |  |  |  |  |  |
| Mar-14 | 11.3 |  |  |  |  |  |  |  |  |  |  |  |  |  |  |  |  |  |  |  |  |  |  |  |  |  |  |  |  |  |  |  |  |  |  |  |  |  |  |  |  |  |  |  |  |  |  |  |  |  |  |
| Apr-14 | 9.4 |  |  |  |  |  |  |  |  |  |  |  |  |  |  |  |  |  |  |  |  |  |  |  |  |  |  |  |  |  |  |  |  |  |  |  |  |  |  |  |  |  |  |  |  |  |  |  |  |  |  |
| May-14 | 8.6 |  |  |  |  |  |  |  |  |  |  |  |  |  |  |  |  |  |  |  |  |  |  |  |  |  |  |  |  |  |  |  |  |  |  |  |  |  |  |  |  |  |  |  |  |  |  |  |  |  |  |
| Jun-14 | 8.2 |  |  |  |  |  |  |  |  |  |  |  |  |  |  |  |  |  |  |  |  |  |  |  |  |  |  |  |  |  |  |  |  |  |  |  |  |  |  |  |  |  |  |  |  |  |  |  |  |  |  |
| Jul-14 | 7.5 |  |  |  |  |  |  |  |  |  |  |  |  |  |  |  |  |  |  |  |  |  |  |  |  |  |  |  |  |  |  |  |  |  |  |  |  |  |  |  |  |  |  |  |  |  |  |  |  |  |  |
| Aug-14 | 7.7 |  |  |  |  |  |  |  |  |  |  |  |  |  |  |  |  |  |  |  |  |  |  |  |  |  |  |  |  |  |  |  |  |  |  |  |  |  |  |  |  |  |  |  |  |  |  |  |  |  |  |
| Sep-14 | 7 |  |  |  |  |  |  |  |  |  |  |  |  |  |  |  |  |  |  |  |  |  |  |  |  |  |  |  |  |  |  |  |  |  |  |  |  |  |  |  |  |  |  |  |  |  |  |  |  |  |  |
| Oct-14 | 6.4 |  |  |  |  |  |  |  |  |  |  |  |  |  |  |  |  |  |  |  |  |  |  |  |  |  |  |  |  |  |  |  |  |  |  |  |  |  |  |  |  |  |  |  |  |  |  |  |  |  |  |
| Nov-14 | 7.5 |  |  |  |  |  |  |  |  |  |  |  |  |  |  |  |  |  |  |  |  |  |  |  |  |  |  |  |  |  |  |  |  |  |  |  |  |  |  |  |  |  |  |  |  |  |  |  |  |  |  |
| Dec-14 | 8.3 |  |  |  |  |  |  |  |  |  |  |  |  |  |  |  |  |  |  |  |  |  |  |  |  |  |  |  |  |  |  |  |  |  |  |  |  |  |  |  |  |  |  |  |  |  |  |  |  |  |  |
| Jan-15 | 9.8 |  |  |  |  |  |  |  |  |  |  |  |  |  |  |  |  |  |  |  |  |  |  |  |  |  |  |  |  |  |  |  |  |  |  |  |  |  |  |  |  |  |  |  |  |  |  |  |  |  |  |
| Feb-15 | 10.6 |  |  |  |  |  |  |  |  |  |  |  |  |  |  |  |  |  |  |  |  |  |  |  |  |  |  |  |  |  |  |  |  |  |  |  |  |  |  |  |  |  |  |  |  |  |  |  |  |  |  |
| Mar-15 | 9.5 |  |  |  |  |  |  |  |  |  |  |  |  |  |  |  |  |  |  |  |  |  |  |  |  |  |  |  |  |  |  |  |  |  |  |  |  |  |  |  |  |  |  |  |  |  |  |  |  |  |  |
| Apr-15 | 7.5 |  |  |  |  |  |  |  |  |  |  |  |  |  |  |  |  |  |  |  |  |  |  |  |  |  |  |  |  |  |  |  |  |  |  |  |  |  |  |  |  |  |  |  |  |  |  |  |  |  |  |
| May-15 | 6.7 |  |  |  |  |  |  |  |  |  |  |  |  |  |  |  |  |  |  |  |  |  |  |  |  |  |  |  |  |  |  |  |  |  |  |  |  |  |  |  |  |  |  |  |  |  |  |  |  |  |  |
| Jun-15 | 6.3 |  |  |  |  |  |  |  |  |  |  |  |  |  |  |  |  |  |  |  |  |  |  |  |  |  |  |  |  |  |  |  |  |  |  |  |  |  |  |  |  |  |  |  |  |  |  |  |  |  |  |
| Jul-15 | 5.5 |  |  |  |  |  |  |  |  |  |  |  |  |  |  |  |  |  |  |  |  |  |  |  |  |  |  |  |  |  |  |  |  |  |  |  |  |  |  |  |  |  |  |  |  |  |  |  |  |  |  |
| Aug-15 | 6.1 |  |  |  |  |  |  |  |  |  |  |  |  |  |  |  |  |  |  |  |  |  |  |  |  |  |  |  |  |  |  |  |  |  |  |  |  |  |  |  |  |  |  |  |  |  |  |  |  |  |  |
| Sep-15 | 5.5 |  |  |  |  |  |  |  |  |  |  |  |  |  |  |  |  |  |  |  |  |  |  |  |  |  |  |  |  |  |  |  |  |  |  |  |  |  |  |  |  |  |  |  |  |  |  |  |  |  |  |
| Oct-15 | 6.2 |  |  |  |  |  |  |  |  |  |  |  |  |  |  |  |  |  |  |  |  |  |  |  |  |  |  |  |  |  |  |  |  |  |  |  |  |  |  |  |  |  |  |  |  |  |  |  |  |  |  |
| Nov-15 | 6.2 |  |  |  |  |  |  |  |  |  |  |  |  |  |  |  |  |  |  |  |  |  |  |  |  |  |  |  |  |  |  |  |  |  |  |  |  |  |  |  |  |  |  |  |  |  |  |  |  |  |  |
| Dec-15 | 7.5 |  |  |  |  |  |  |  |  |  |  |  |  |  |  |  |  |  |  |  |  |  |  |  |  |  |  |  |  |  |  |  |  |  |  |  |  |  |  |  |  |  |  |  |  |  |  |  |  |  |  |
| Jan-16 | 8.5 |  |  |  |  |  |  |  |  |  |  |  |  |  |  |  |  |  |  |  |  |  |  |  |  |  |  |  |  |  |  |  |  |  |  |  |  |  |  |  |  |  |  |  |  |  |  |  |  |  |  |
| Feb-16 | 8.7 |  |  |  |  |  |  |  |  |  |  |  |  |  |  |  |  |  |  |  |  |  |  |  |  |  |  |  |  |  |  |  |  |  |  |  |  |  |  |  |  |  |  |  |  |  |  |  |  |  |  |
| Mar-16 | 8.7 |  |  |  |  |  |  |  |  |  |  |  |  |  |  |  |  |  |  |  |  |  |  |  |  |  |  |  |  |  |  |  |  |  |  |  |  |  |  |  |  |  |  |  |  |  |  |  |  |  |  |
| Apr-16 | 6 |  |  |  |  |  |  |  |  |  |  |  |  |  |  |  |  |  |  |  |  |  |  |  |  |  |  |  |  |  |  |  |  |  |  |  |  |  |  |  |  |  |  |  |  |  |  |  |  |  |  |
| May-16 | 5.2 |  |  |  |  |  |  |  |  |  |  |  |  |  |  |  |  |  |  |  |  |  |  |  |  |  |  |  |  |  |  |  |  |  |  |  |  |  |  |  |  |  |  |  |  |  |  |  |  |  |  |
| Jun-16 | 4.6 |  |  |  |  |  |  |  |  |  |  |  |  |  |  |  |  |  |  |  |  |  |  |  |  |  |  |  |  |  |  |  |  |  |  |  |  |  |  |  |  |  |  |  |  |  |  |  |  |  |  |
| Jul-16 | 4.5 |  |  |  |  |  |  |  |  |  |  |  |  |  |  |  |  |  |  |  |  |  |  |  |  |  |  |  |  |  |  |  |  |  |  |  |  |  |  |  |  |  |  |  |  |  |  |  |  |  |  |
| Aug-16 | 5.1 |  |  |  |  |  |  |  |  |  |  |  |  |  |  |  |  |  |  |  |  |  |  |  |  |  |  |  |  |  |  |  |  |  |  |  |  |  |  |  |  |  |  |  |  |  |  |  |  |  |  |
| Sep-16 | 5.2 |  |  |  |  |  |  |  |  |  |  |  |  |  |  |  |  |  |  |  |  |  |  |  |  |  |  |  |  |  |  |  |  |  |  |  |  |  |  |  |  |  |  |  |  |  |  |  |  |  |  |
| Oct-16 | 5.7 |  |  |  |  |  |  |  |  |  |  |  |  |  |  |  |  |  |  |  |  |  |  |  |  |  |  |  |  |  |  |  |  |  |  |  |  |  |  |  |  |  |  |  |  |  |  |  |  |  |  |
| Nov-16 | 5.7 |  |  |  |  |  |  |  |  |  |  |  |  |  |  |  |  |  |  |  |  |  |  |  |  |  |  |  |  |  |  |  |  |  |  |  |  |  |  |  |  |  |  |  |  |  |  |  |  |  |  |
| Dec-16 | 7.4 |  |  |  |  |  |  |  |  |  |  |  |  |  |  |  |  |  |  |  |  |  |  |  |  |  |  |  |  |  |  |  |  |  |  |  |  |  |  |  |  |  |  |  |  |  |  |  |  |  |  |
| Jan-17 | 9.4 |  |  |  |  |  |  |  |  |  |  |  |  |  |  |  |  |  |  |  |  |  |  |  |  |  |  |  |  |  |  |  |  |  |  |  |  |  |  |  |  |  |  |  |  |  |  |  |  |  |  |
| Feb-17 | 8.8 |  |  |  |  |  |  |  |  |  |  |  |  |  |  |  |  |  |  |  |  |  |  |  |  |  |  |  |  |  |  |  |  |  |  |  |  |  |  |  |  |  |  |  |  |  |  |  |  |  |  |
| Mar-17 | 8.4 |  |  |  |  |  |  |  |  |  |  |  |  |  |  |  |  |  |  |  |  |  |  |  |  |  |  |  |  |  |  |  |  |  |  |  |  |  |  |  |  |  |  |  |  |  |  |  |  |  |  |
| Apr-17 | 6.3 |  |  |  |  |  |  |  |  |  |  |  |  |  |  |  |  |  |  |  |  |  |  |  |  |  |  |  |  |  |  |  |  |  |  |  |  |  |  |  |  |  |  |  |  |  |  |  |  |  |  |
| May-17 | 5.3 |  |  |  |  |  |  |  |  |  |  |  |  |  |  |  |  |  |  |  |  |  |  |  |  |  |  |  |  |  |  |  |  |  |  |  |  |  |  |  |  |  |  |  |  |  |  |  |  |  |  |
| Jun-17 | 4.5 |  |  |  |  |  |  |  |  |  |  |  |  |  |  |  |  |  |  |  |  |  |  |  |  |  |  |  |  |  |  |  |  |  |  |  |  |  |  |  |  |  |  |  |  |  |  |  |  |  |  |
| Jul-17 | 4.9 |  |  |  |  |  |  |  |  |  |  |  |  |  |  |  |  |  |  |  |  |  |  |  |  |  |  |  |  |  |  |  |  |  |  |  |  |  |  |  |  |  |  |  |  |  |  |  |  |  |  |
| Aug-17 | 4.7 |  |  |  |  |  |  |  |  |  |  |  |  |  |  |  |  |  |  |  |  |  |  |  |  |  |  |  |  |  |  |  |  |  |  |  |  |  |  |  |  |  |  |  |  |  |  |  |  |  |  |
| Sep-17 | 4.7 |  |  |  |  |  |  |  |  |  |  |  |  |  |  |  |  |  |  |  |  |  |  |  |  |  |  |  |  |  |  |  |  |  |  |  |  |  |  |  |  |  |  |  |  |  |  |  |  |  |  |
| Oct-17 | 4.5 |  |  |  |  |  |  |  |  |  |  |  |  |  |  |  |  |  |  |  |  |  |  |  |  |  |  |  |  |  |  |  |  |  |  |  |  |  |  |  |  |  |  |  |  |  |  |  |  |  |  |
| Nov-17 | 5 |  |  |  |  |  |  |  |  |  |  |  |  |  |  |  |  |  |  |  |  |  |  |  |  |  |  |  |  |  |  |  |  |  |  |  |  |  |  |  |  |  |  |  |  |  |  |  |  |  |  |
| Dec-17 | 5.9 |  |  |  |  |  |  |  |  |  |  |  |  |  |  |  |  |  |  |  |  |  |  |  |  |  |  |  |  |  |  |  |  |  |  |  |  |  |  |  |  |  |  |  |  |  |  |  |  |  |  |
| Jan-18 | 7.3 |  |  |  |  |  |  |  |  |  |  |  |  |  |  |  |  |  |  |  |  |  |  |  |  |  |  |  |  |  |  |  |  |  |  |  |  |  |  |  |  |  |  |  |  |  |  |  |  |  |  |
| Feb-18 | 7.8 |  |  |  |  |  |  |  |  |  |  |  |  |  |  |  |  |  |  |  |  |  |  |  |  |  |  |  |  |  |  |  |  |  |  |  |  |  |  |  |  |  |  |  |  |  |  |  |  |  |  |
| Mar-18 | 7.4 |  |  |  |  |  |  |  |  |  |  |  |  |  |  |  |  |  |  |  |  |  |  |  |  |  |  |  |  |  |  |  |  |  |  |  |  |  |  |  |  |  |  |  |  |  |  |  |  |  |  |
| Apr-18 | 6.5 |  |  |  |  |  |  |  |  |  |  |  |  |  |  |  |  |  |  |  |  |  |  |  |  |  |  |  |  |  |  |  |  |  |  |  |  |  |  |  |  |  |  |  |  |  |  |  |  |  |  |
| May-18 | 4.4 |  |  |  |  |  |  |  |  |  |  |  |  |  |  |  |  |  |  |  |  |  |  |  |  |  |  |  |  |  |  |  |  |  |  |  |  |  |  |  |  |  |  |  |  |  |  |  |  |  |  |
| Jun-18 | 4.7 |  |  |  |  |  |  |  |  |  |  |  |  |  |  |  |  |  |  |  |  |  |  |  |  |  |  |  |  |  |  |  |  |  |  |  |  |  |  |  |  |  |  |  |  |  |  |  |  |  |  |
| Jul-18 | 3.4 |  |  |  |  |  |  |  |  |  |  |  |  |  |  |  |  |  |  |  |  |  |  |  |  |  |  |  |  |  |  |  |  |  |  |  |  |  |  |  |  |  |  |  |  |  |  |  |  |  |  |
| Aug-18 | 3.4 |  |  |  |  |  |  |  |  |  |  |  |  |  |  |  |  |  |  |  |  |  |  |  |  |  |  |  |  |  |  |  |  |  |  |  |  |  |  |  |  |  |  |  |  |  |  |  |  |  |  |
| Sep-18 | 4.1 |  |  |  |  |  |  |  |  |  |  |  |  |  |  |  |  |  |  |  |  |  |  |  |  |  |  |  |  |  |  |  |  |  |  |  |  |  |  |  |  |  |  |  |  |  |  |  |  |  |  |
| Oct-18 | 3.6 |  |  |  |  |  |  |  |  |  |  |  |  |  |  |  |  |  |  |  |  |  |  |  |  |  |  |  |  |  |  |  |  |  |  |  |  |  |  |  |  |  |  |  |  |  |  |  |  |  |  |
| Nov-18 | 3.9 |  |  |  |  |  |  |  |  |  |  |  |  |  |  |  |  |  |  |  |  |  |  |  |  |  |  |  |  |  |  |  |  |  |  |  |  |  |  |  |  |  |  |  |  |  |  |  |  |  |  |
| Dec-18 | 5.1 |  |  |  |  |  |  |  |  |  |  |  |  |  |  |  |  |  |  |  |  |  |  |  |  |  |  |  |  |  |  |  |  |  |  |  |  |  |  |  |  |  |  |  |  |  |  |  |  |  |  |
| Jan-19 | 6.4 |  |  |  |  |  |  |  |  |  |  |  |  |  |  |  |  |  |  |  |  |  |  |  |  |  |  |  |  |  |  |  |  |  |  |  |  |  |  |  |  |  |  |  |  |  |  |  |  |  |  |
| Feb-19 | 6.2 |  |  |  |  |  |  |  |  |  |  |  |  |  |  |  |  |  |  |  |  |  |  |  |  |  |  |  |  |  |  |  |  |  |  |  |  |  |  |  |  |  |  |  |  |  |  |  |  |  |  |
| Mar-19 | 5.2 |  |  |  |  |  |  |  |  |  |  |  |  |  |  |  |  |  |  |  |  |  |  |  |  |  |  |  |  |  |  |  |  |  |  |  |  |  |  |  |  |  |  |  |  |  |  |  |  |  |  |
| Apr-19 | 4.7 |  |  |  |  |  |  |  |  |  |  |  |  |  |  |  |  |  |  |  |  |  |  |  |  |  |  |  |  |  |  |  |  |  |  |  |  |  |  |  |  |  |  |  |  |  |  |  |  |  |  |
| May-19 | 3.2 |  |  |  |  |  |  |  |  |  |  |  |  |  |  |  |  |  |  |  |  |  |  |  |  |  |  |  |  |  |  |  |  |  |  |  |  |  |  |  |  |  |  |  |  |  |  |  |  |  |  |
| Jun-19 | 4 |  |  |  |  |  |  |  |  |  |  |  |  |  |  |  |  |  |  |  |  |  |  |  |  |  |  |  |  |  |  |  |  |  |  |  |  |  |  |  |  |  |  |  |  |  |  |  |  |  |  |
| Jul-19 | 3.8 |  |  |  |  |  |  |  |  |  |  |  |  |  |  |  |  |  |  |  |  |  |  |  |  |  |  |  |  |  |  |  |  |  |  |  |  |  |  |  |  |  |  |  |  |  |  |  |  |  |  |
| Aug-19 | 3.6 |  |  |  |  |  |  |  |  |  |  |  |  |  |  |  |  |  |  |  |  |  |  |  |  |  |  |  |  |  |  |  |  |  |  |  |  |  |  |  |  |  |  |  |  |  |  |  |  |  |  |
| Sep-19 | 3.2 |  |  |  |  |  |  |  |  |  |  |  |  |  |  |  |  |  |  |  |  |  |  |  |  |  |  |  |  |  |  |  |  |  |  |  |  |  |  |  |  |  |  |  |  |  |  |  |  |  |  |
| Oct-19 | 4 |  |  |  |  |  |  |  |  |  |  |  |  |  |  |  |  |  |  |  |  |  |  |  |  |  |  |  |  |  |  |  |  |  |  |  |  |  |  |  |  |  |  |  |  |  |  |  |  |  |  |
| Nov-19 | 4.4 |  |  |  |  |  |  |  |  |  |  |  |  |  |  |  |  |  |  |  |  |  |  |  |  |  |  |  |  |  |  |  |  |  |  |  |  |  |  |  |  |  |  |  |  |  |  |  |  |  |  |
| Dec-19 | 5 |  |  |  |  |  |  |  |  |  |  |  |  |  |  |  |  |  |  |  |  |  |  |  |  |  |  |  |  |  |  |  |  |  |  |  |  |  |  |  |  |  |  |  |  |  |  |  |  |  |  |
| Jan-20 | 5.4 |  |  |  |  |  |  |  |  |  |  |  |  |  |  |  |  |  |  |  |  |  |  |  |  |  |  |  |  |  |  |  |  |  |  |  |  |  |  |  |  |  |  |  |  |  |  |  |  |  |  |
| Feb-20 | 5.5 |  |  |  |  |  |  |  |  |  |  |  |  |  |  |  |  |  |  |  |  |  |  |  |  |  |  |  |  |  |  |  |  |  |  |  |  |  |  |  |  |  |  |  |  |  |  |  |  |  |  |
| Mar-20 | 6.9 |  |  |  |  |  |  |  |  |  |  |  |  |  |  |  |  |  |  |  |  |  |  |  |  |  |  |  |  |  |  |  |  |  |  |  |  |  |  |  |  |  |  |  |  |  |  |  |  |  |  |
| Apr-20 | 16.6 |  |  |  |  |  |  |  |  |  |  |  |  |  |  |  |  |  |  |  |  |  |  |  |  |  |  |  |  |  |  |  |  |  |  |  |  |  |  |  |  |  |  |  |  |  |  |  |  |  |  |
| May-20 | 12.7 |  |  |  |  |  |  |  |  |  |  |  |  |  |  |  |  |  |  |  |  |  |  |  |  |  |  |  |  |  |  |  |  |  |  |  |  |  |  |  |  |  |  |  |  |  |  |  |  |  |  |
| Jun-20 | 10.1 |  |  |  |  |  |  |  |  |  |  |  |  |  |  |  |  |  |  |  |  |  |  |  |  |  |  |  |  |  |  |  |  |  |  |  |  |  |  |  |  |  |  |  |  |  |  |  |  |  |  |
| Jul-20 | 8.9 |  |  |  |  |  |  |  |  |  |  |  |  |  |  |  |  |  |  |  |  |  |  |  |  |  |  |  |  |  |  |  |  |  |  |  |  |  |  |  |  |  |  |  |  |  |  |  |  |  |  |
| Aug-20 | 7.6 |  |  |  |  |  |  |  |  |  |  |  |  |  |  |  |  |  |  |  |  |  |  |  |  |  |  |  |  |  |  |  |  |  |  |  |  |  |  |  |  |  |  |  |  |  |  |  |  |  |  |
| Sep-20 | 7.1 |  |  |  |  |  |  |  |  |  |  |  |  |  |  |  |  |  |  |  |  |  |  |  |  |  |  |  |  |  |  |  |  |  |  |  |  |  |  |  |  |  |  |  |  |  |  |  |  |  |  |
| Oct-20 | 6.8 |  |  |  |  |  |  |  |  |  |  |  |  |  |  |  |  |  |  |  |  |  |  |  |  |  |  |  |  |  |  |  |  |  |  |  |  |  |  |  |  |  |  |  |  |  |  |  |  |  |  |
| Nov-20 | 7.3 |  |  |  |  |  |  |  |  |  |  |  |  |  |  |  |  |  |  |  |  |  |  |  |  |  |  |  |  |  |  |  |  |  |  |  |  |  |  |  |  |  |  |  |  |  |  |  |  |  |  |
| Dec-20 | 9.6 |  |  |  |  |  |  |  |  |  |  |  |  |  |  |  |  |  |  |  |  |  |  |  |  |  |  |  |  |  |  |  |  |  |  |  |  |  |  |  |  |  |  |  |  |  |  |  |  |  |  |
| Jan-21 | 9.4 |  |  |  |  |  |  |  |  |  |  |  |  |  |  |  |  |  |  |  |  |  |  |  |  |  |  |  |  |  |  |  |  |  |  |  |  |  |  |  |  |  |  |  |  |  |  |  |  |  |  |
| Feb-21 | 9.6 |  |  |  |  |  |  |  |  |  |  |  |  |  |  |  |  |  |  |  |  |  |  |  |  |  |  |  |  |  |  |  |  |  |  |  |  |  |  |  |  |  |  |  |  |  |  |  |  |  |  |
| Mar-21 | 8.6 |  |  |  |  |  |  |  |  |  |  |  |  |  |  |  |  |  |  |  |  |  |  |  |  |  |  |  |  |  |  |  |  |  |  |  |  |  |  |  |  |  |  |  |  |  |  |  |  |  |  |
| Apr-21 | 7.7 |  |  |  |  |  |  |  |  |  |  |  |  |  |  |  |  |  |  |  |  |  |  |  |  |  |  |  |  |  |  |  |  |  |  |  |  |  |  |  |  |  |  |  |  |  |  |  |  |  |  |
| May-21 | 6.7 |  |  |  |  |  |  |  |  |  |  |  |  |  |  |  |  |  |  |  |  |  |  |  |  |  |  |  |  |  |  |  |  |  |  |  |  |  |  |  |  |  |  |  |  |  |  |  |  |  |  |
| Jun-21 | 7.5 |  |  |  |  |  |  |  |  |  |  |  |  |  |  |  |  |  |  |  |  |  |  |  |  |  |  |  |  |  |  |  |  |  |  |  |  |  |  |  |  |  |  |  |  |  |  |  |  |  |  |
| Jul-21 | 6.1 |  |  |  |  |  |  |  |  |  |  |  |  |  |  |  |  |  |  |  |  |  |  |  |  |  |  |  |  |  |  |  |  |  |  |  |  |  |  |  |  |  |  |  |  |  |  |  |  |  |  |
| Aug-21 | 4.6 |  |  |  |  |  |  |  |  |  |  |  |  |  |  |  |  |  |  |  |  |  |  |  |  |  |  |  |  |  |  |  |  |  |  |  |  |  |  |  |  |  |  |  |  |  |  |  |  |  |  |
| Sep-21 | 4.5 |  |  |  |  |  |  |  |  |  |  |  |  |  |  |  |  |  |  |  |  |  |  |  |  |  |  |  |  |  |  |  |  |  |  |  |  |  |  |  |  |  |  |  |  |  |  |  |  |  |  |
| Oct-21 | 4 |  |  |  |  |  |  |  |  |  |  |  |  |  |  |  |  |  |  |  |  |  |  |  |  |  |  |  |  |  |  |  |  |  |  |  |  |  |  |  |  |  |  |  |  |  |  |  |  |  |  |
| Nov-21 | 4.7 |  |  |  |  |  |  |  |  |  |  |  |  |  |  |  |  |  |  |  |  |  |  |  |  |  |  |  |  |  |  |  |  |  |  |  |  |  |  |  |  |  |  |  |  |  |  |  |  |  |  |
| Dec-21 | 5 |  |  |  |  |  |  |  |  |  |  |  |  |  |  |  |  |  |  |  |  |  |  |  |  |  |  |  |  |  |  |  |  |  |  |  |  |  |  |  |  |  |  |  |  |  |  |  |  |  |  |
| Jan-22 | 7.1 |  |  |  |  |  |  |  |  |  |  |  |  |  |  |  |  |  |  |  |  |  |  |  |  |  |  |  |  |  |  |  |  |  |  |  |  |  |  |  |  |  |  |  |  |  |  |  |  |  |  |
| Feb-22 | 6.7 |  |  |  |  |  |  |  |  |  |  |  |  |  |  |  |  |  |  |  |  |  |  |  |  |  |  |  |  |  |  |  |  |  |  |  |  |  |  |  |  |  |  |  |  |  |  |  |  |  |  |
| Mar-22 | 6 |  |  |  |  |  |  |  |  |  |  |  |  |  |  |  |  |  |  |  |  |  |  |  |  |  |  |  |  |  |  |  |  |  |  |  |  |  |  |  |  |  |  |  |  |  |  |  |  |  |  |
| Apr-22 | 4.6 |  |  |  |  |  |  |  |  |  |  |  |  |  |  |  |  |  |  |  |  |  |  |  |  |  |  |  |  |  |  |  |  |  |  |  |  |  |  |  |  |  |  |  |  |  |  |  |  |  |  |
| May-22 | 3.8 |  |  |  |  |  |  |  |  |  |  |  |  |  |  |  |  |  |  |  |  |  |  |  |  |  |  |  |  |  |  |  |  |  |  |  |  |  |  |  |  |  |  |  |  |  |  |  |  |  |  |
| Jun-22 | 3.7 |  |  |  |  |  |  |  |  |  |  |  |  |  |  |  |  |  |  |  |  |  |  |  |  |  |  |  |  |  |  |  |  |  |  |  |  |  |  |  |  |  |  |  |  |  |  |  |  |  |  |
| Jul-22 | 3.5 |  |  |  |  |  |  |  |  |  |  |  |  |  |  |  |  |  |  |  |  |  |  |  |  |  |  |  |  |  |  |  |  |  |  |  |  |  |  |  |  |  |  |  |  |  |  |  |  |  |  |
| Aug-22 | 3.9 |  |  |  |  |  |  |  |  |  |  |  |  |  |  |  |  |  |  |  |  |  |  |  |  |  |  |  |  |  |  |  |  |  |  |  |  |  |  |  |  |  |  |  |  |  |  |  |  |  |  |
| Sep-22 | 3.4 |  |  |  |  |  |  |  |  |  |  |  |  |  |  |  |  |  |  |  |  |  |  |  |  |  |  |  |  |  |  |  |  |  |  |  |  |  |  |  |  |  |  |  |  |  |  |  |  |  |  |
| Oct-22 | 4.1 |  |  |  |  |  |  |  |  |  |  |  |  |  |  |  |  |  |  |  |  |  |  |  |  |  |  |  |  |  |  |  |  |  |  |  |  |  |  |  |  |  |  |  |  |  |  |  |  |  |  |
| Nov-22 | 3.9 |  |  |  |  |  |  |  |  |  |  |  |  |  |  |  |  |  |  |  |  |  |  |  |  |  |  |  |  |  |  |  |  |  |  |  |  |  |  |  |  |  |  |  |  |  |  |  |  |  |  |
| Dec-22 | 4.4 |  |  |  |  |  |  |  |  |  |  |  |  |  |  |  |  |  |  |  |  |  |  |  |  |  |  |  |  |  |  |  |  |  |  |  |  |  |  |  |  |  |  |  |  |  |  |  |  |  |  |
| Jan-23 | 6.9 |  |  |  |  |  |  |  |  |  |  |  |  |  |  |  |  |  |  |  |  |  |  |  |  |  |  |  |  |  |  |  |  |  |  |  |  |  |  |  |  |  |  |  |  |  |  |  |  |  |  |
| Feb-23 | 6.6 |  |  |  |  |  |  |  |  |  |  |  |  |  |  |  |  |  |  |  |  |  |  |  |  |  |  |  |  |  |  |  |  |  |  |  |  |  |  |  |  |  |  |  |  |  |  |  |  |  |  |
| Mar-23 | 5.6 |  |  |  |  |  |  |  |  |  |  |  |  |  |  |  |  |  |  |  |  |  |  |  |  |  |  |  |  |  |  |  |  |  |  |  |  |  |  |  |  |  |  |  |  |  |  |  |  |  |  |
| Apr-23 | 4.1 |  |  |  |  |  |  |  |  |  |  |  |  |  |  |  |  |  |  |  |  |  |  |  |  |  |  |  |  |  |  |  |  |  |  |  |  |  |  |  |  |  |  |  |  |  |  |  |  |  |  |
| May-23 | 3.5 |  |  |  |  |  |  |  |  |  |  |  |  |  |  |  |  |  |  |  |  |  |  |  |  |  |  |  |  |  |  |  |  |  |  |  |  |  |  |  |  |  |  |  |  |  |  |  |  |  |  |
| Jun-23 | 3.6 |  |  |  |  |  |  |  |  |  |  |  |  |  |  |  |  |  |  |  |  |  |  |  |  |  |  |  |  |  |  |  |  |  |  |  |  |  |  |  |  |  |  |  |  |  |  |  |  |  |  |
| Jul-23 | 3.9 |  |  |  |  |  |  |  |  |  |  |  |  |  |  |  |  |  |  |  |  |  |  |  |  |  |  |  |  |  |  |  |  |  |  |  |  |  |  |  |  |  |  |  |  |  |  |  |  |  |  |
| Aug-23 | 3.9 |  |  |  |  |  |  |  |  |  |  |  |  |  |  |  |  |  |  |  |  |  |  |  |  |  |  |  |  |  |  |  |  |  |  |  |  |  |  |  |  |  |  |  |  |  |  |  |  |  |  |
| Sep-23 | 3.8 |  |  |  |  |  |  |  |  |  |  |  |  |  |  |  |  |  |  |  |  |  |  |  |  |  |  |  |  |  |  |  |  |  |  |  |  |  |  |  |  |  |  |  |  |  |  |  |  |  |  |